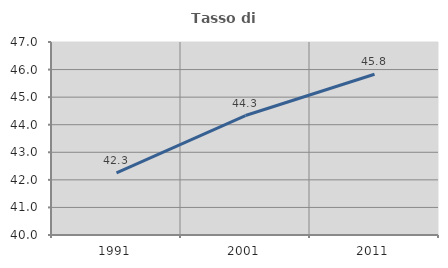
| Category | Tasso di occupazione   |
|---|---|
| 1991.0 | 42.256 |
| 2001.0 | 44.333 |
| 2011.0 | 45.829 |